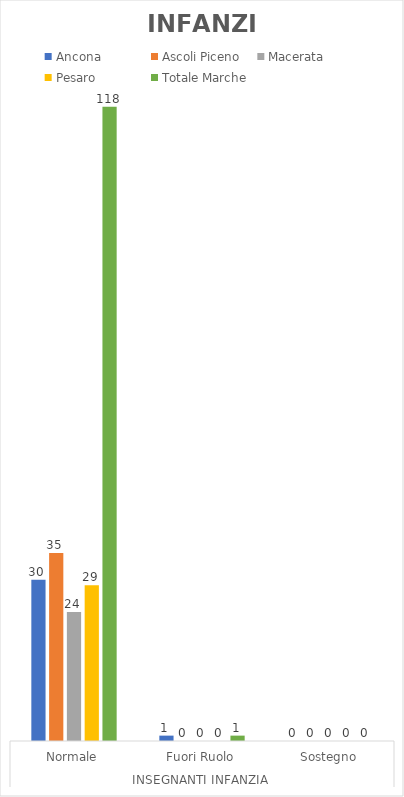
| Category | Ancona | Ascoli Piceno | Macerata | Pesaro | Totale Marche |
|---|---|---|---|---|---|
| 0 | 30 | 35 | 24 | 29 | 118 |
| 1 | 1 | 0 | 0 | 0 | 1 |
| 2 | 0 | 0 | 0 | 0 | 0 |